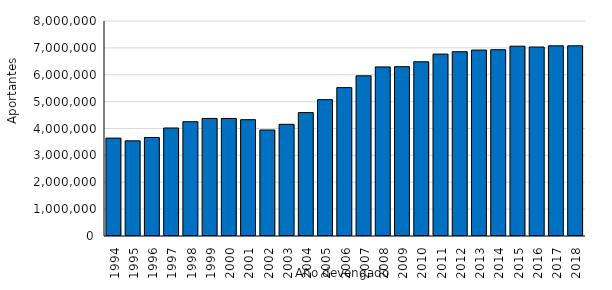
| Category | Demora en el pago hasta 12 meses |
|---|---|
| 1994.0 | 3641898 |
| 1995.0 | 3540967 |
| 1996.0 | 3664904 |
| 1997.0 | 4019165 |
| 1998.0 | 4253063 |
| 1999.0 | 4374796 |
| 2000.0 | 4374378 |
| 2001.0 | 4327807 |
| 2002.0 | 3945082 |
| 2003.0 | 4155410 |
| 2004.0 | 4592049 |
| 2005.0 | 5073930 |
| 2006.0 | 5520906 |
| 2007.0 | 5960080 |
| 2008.0 | 6291484 |
| 2009.0 | 6300186 |
| 2010.0 | 6482639 |
| 2011.0 | 6768227 |
| 2012.0 | 6856910 |
| 2013.0 | 6918139 |
| 2014.0 | 6931439 |
| 2015.0 | 7062746 |
| 2016.0 | 7032247 |
| 2017.0 | 7076572 |
| 2018.0 | 7077079 |